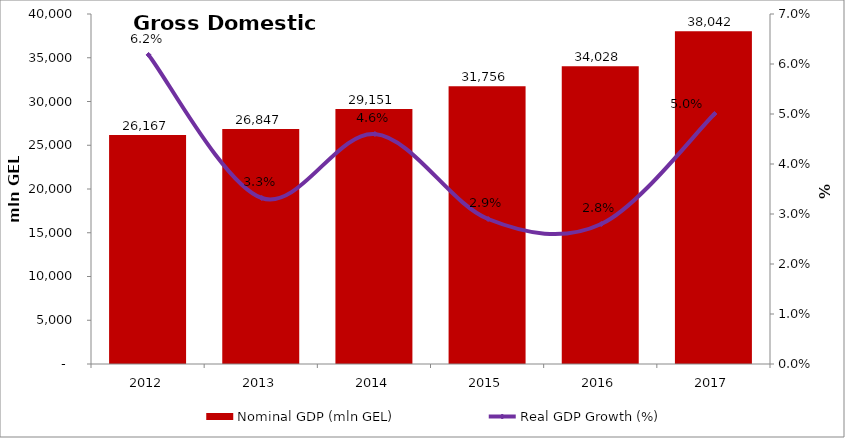
| Category | Nominal GDP (mln GEL) |
|---|---|
| 2012.0 | 26167.284 |
| 2013.0 | 26847.354 |
| 2014.0 | 29150.5 |
| 2015.0 | 31755.6 |
| 2016.0 | 34028.452 |
| 2017.0 | 38042.2 |